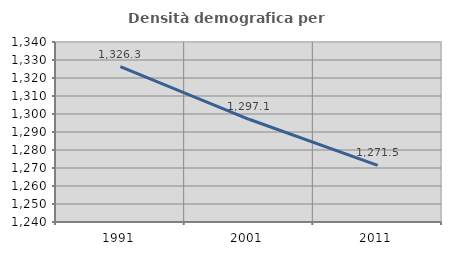
| Category | Densità demografica |
|---|---|
| 1991.0 | 1326.281 |
| 2001.0 | 1297.072 |
| 2011.0 | 1271.47 |